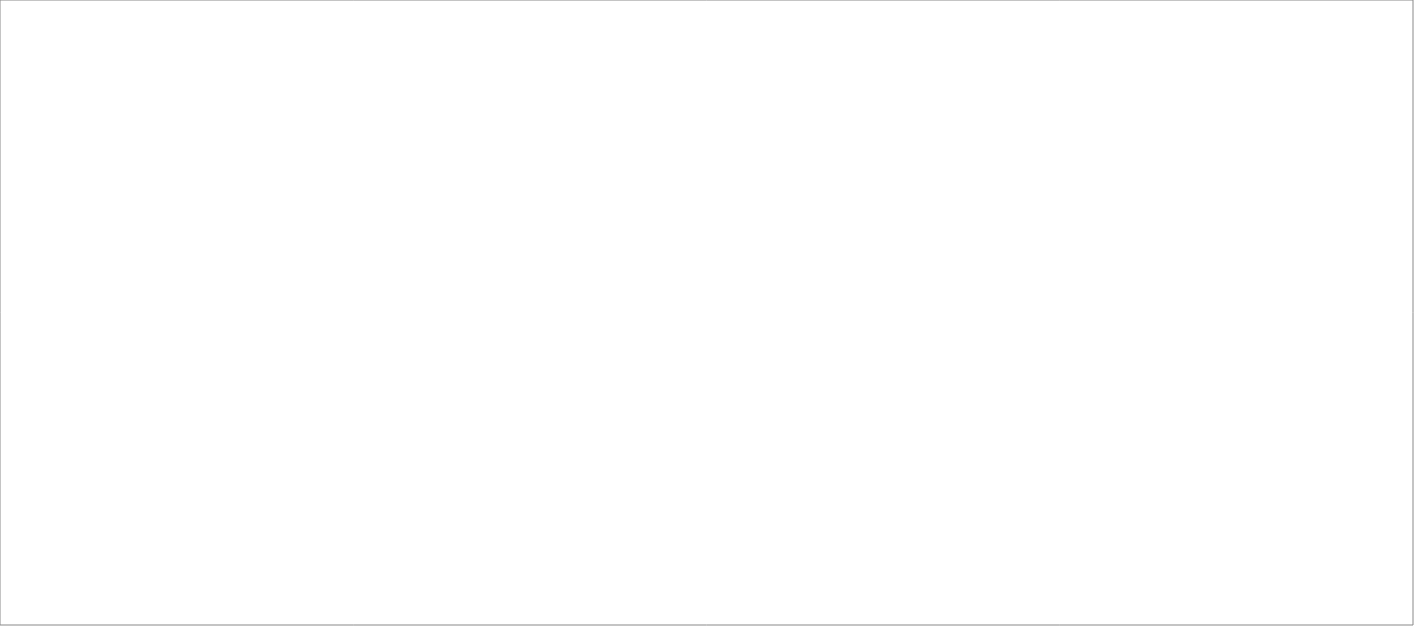
| Category | Total |
|---|---|
| Poolia Sverige AB | 85 |
| Randstad AB | 80 |
| Clockwork Bemanning & Rekrytering AB | 71.7 |
| Experis AB | 45 |
| Source Executive Recruitment Sweden AB | 25 |